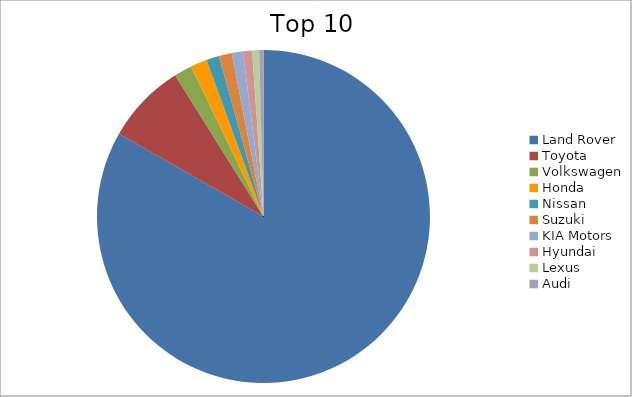
| Category | Series 0 |
|---|---|
| Land Rover | 83.27 |
| Toyota | 7.82 |
| Volkswagen | 1.74 |
| Honda | 1.6 |
| Nissan | 1.25 |
| Suzuki | 1.25 |
| KIA Motors | 1.09 |
| Hyundai | 0.88 |
| Lexus | 0.67 |
| Audi | 0.42 |